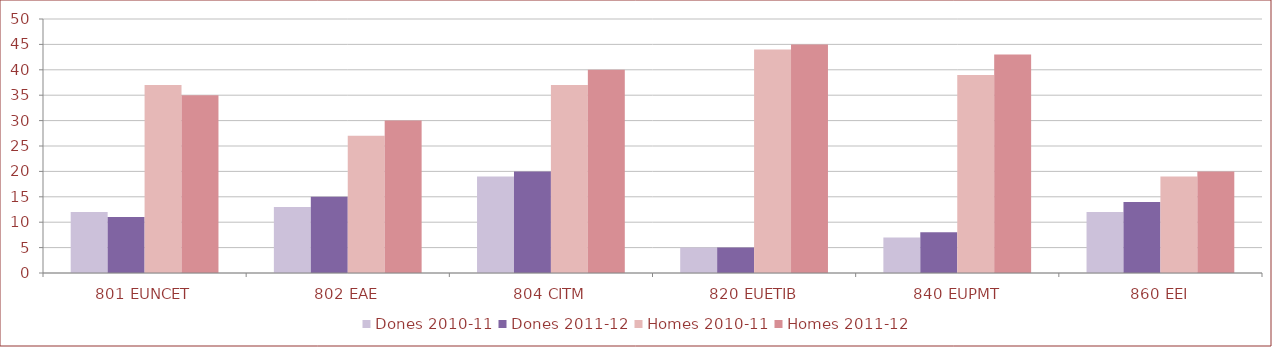
| Category | Dones 2010-11 | Dones 2011-12 | Homes 2010-11 | Homes 2011-12 |
|---|---|---|---|---|
| 801 EUNCET | 12 | 11 | 37 | 35 |
| 802 EAE | 13 | 15 | 27 | 30 |
| 804 CITM | 19 | 20 | 37 | 40 |
| 820 EUETIB | 5 | 5 | 44 | 45 |
| 840 EUPMT | 7 | 8 | 39 | 43 |
| 860 EEI | 12 | 14 | 19 | 20 |